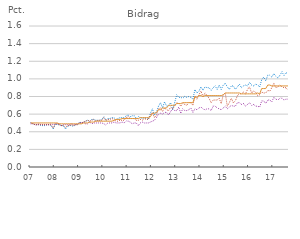
| Category | Nyudlån (variabel rente) | Nyudlån (fast rente) | Nyudlån (samlet) | Udestående udlån |
|---|---|---|---|---|
| 07 | 0.5 | 0.49 | 0.5 | 0.5 |
|  | 0.49 | 0.49 | 0.49 | 0.5 |
|  | 0.48 | 0.48 | 0.48 | 0.5 |
|  | 0.48 | 0.48 | 0.48 | 0.5 |
|  | 0.48 | 0.49 | 0.48 | 0.5 |
|  | 0.47 | 0.48 | 0.48 | 0.5 |
|  | 0.47 | 0.48 | 0.48 | 0.5 |
|  | 0.47 | 0.48 | 0.48 | 0.5 |
|  | 0.48 | 0.48 | 0.48 | 0.5 |
|  | 0.48 | 0.48 | 0.48 | 0.5 |
|  | 0.47 | 0.49 | 0.48 | 0.5 |
|  | 0.43 | 0.48 | 0.44 | 0.5 |
| 08 | 0.49 | 0.49 | 0.49 | 0.5 |
|  | 0.48 | 0.49 | 0.49 | 0.5 |
|  | 0.48 | 0.49 | 0.48 | 0.49 |
|  | 0.47 | 0.47 | 0.47 | 0.49 |
|  | 0.47 | 0.48 | 0.47 | 0.49 |
|  | 0.43 | 0.48 | 0.45 | 0.49 |
|  | 0.46 | 0.48 | 0.47 | 0.49 |
|  | 0.47 | 0.48 | 0.47 | 0.49 |
|  | 0.47 | 0.49 | 0.48 | 0.49 |
|  | 0.46 | 0.48 | 0.47 | 0.49 |
|  | 0.48 | 0.48 | 0.48 | 0.49 |
|  | 0.48 | 0.49 | 0.48 | 0.49 |
| 09 | 0.51 | 0.5 | 0.5 | 0.49 |
|  | 0.5 | 0.5 | 0.5 | 0.49 |
|  | 0.51 | 0.51 | 0.51 | 0.5 |
|  | 0.52 | 0.49 | 0.52 | 0.5 |
|  | 0.53 | 0.49 | 0.53 | 0.5 |
|  | 0.52 | 0.51 | 0.52 | 0.51 |
|  | 0.54 | 0.49 | 0.53 | 0.51 |
|  | 0.54 | 0.5 | 0.54 | 0.51 |
|  | 0.53 | 0.5 | 0.52 | 0.52 |
|  | 0.53 | 0.5 | 0.53 | 0.52 |
|  | 0.53 | 0.5 | 0.53 | 0.52 |
|  | 0.54 | 0.5 | 0.53 | 0.52 |
| 10 | 0.57 | 0.49 | 0.56 | 0.52 |
|  | 0.53 | 0.48 | 0.53 | 0.52 |
|  | 0.55 | 0.5 | 0.54 | 0.52 |
|  | 0.55 | 0.5 | 0.54 | 0.52 |
|  | 0.56 | 0.5 | 0.55 | 0.52 |
|  | 0.56 | 0.51 | 0.54 | 0.53 |
|  | 0.54 | 0.5 | 0.52 | 0.54 |
|  | 0.55 | 0.5 | 0.52 | 0.54 |
|  | 0.56 | 0.5 | 0.53 | 0.54 |
|  | 0.56 | 0.51 | 0.53 | 0.55 |
|  | 0.56 | 0.5 | 0.53 | 0.55 |
|  | 0.58 | 0.52 | 0.56 | 0.55 |
| 11 | 0.59 | 0.52 | 0.57 | 0.55 |
|  | 0.57 | 0.51 | 0.55 | 0.55 |
|  | 0.58 | 0.49 | 0.55 | 0.55 |
|  | 0.58 | 0.5 | 0.55 | 0.55 |
|  | 0.55 | 0.5 | 0.53 | 0.55 |
|  | 0.57 | 0.47 | 0.53 | 0.55 |
|  | 0.56 | 0.5 | 0.54 | 0.56 |
|  | 0.55 | 0.51 | 0.53 | 0.56 |
|  | 0.56 | 0.5 | 0.55 | 0.56 |
|  | 0.55 | 0.5 | 0.54 | 0.56 |
|  | 0.54 | 0.5 | 0.54 | 0.56 |
|  | 0.61 | 0.51 | 0.59 | 0.57 |
| 12 | 0.66 | 0.52 | 0.62 | 0.61 |
|  | 0.59 | 0.53 | 0.56 | 0.61 |
|  | 0.62 | 0.56 | 0.59 | 0.62 |
|  | 0.69 | 0.6 | 0.66 | 0.65 |
|  | 0.73 | 0.61 | 0.67 | 0.65 |
|  | 0.67 | 0.6 | 0.63 | 0.67 |
|  | 0.74 | 0.62 | 0.67 | 0.67 |
|  | 0.69 | 0.62 | 0.65 | 0.67 |
|  | 0.7 | 0.59 | 0.64 | 0.7 |
|  | 0.73 | 0.63 | 0.68 | 0.7 |
|  | 0.65 | 0.66 | 0.66 | 0.7 |
|  | 0.73 | 0.64 | 0.69 | 0.7 |
| 13 | 0.82 | 0.64 | 0.73 | 0.72 |
|  | 0.79 | 0.68 | 0.72 | 0.72 |
|  | 0.79 | 0.61 | 0.69 | 0.72 |
|  | 0.78 | 0.66 | 0.72 | 0.73 |
|  | 0.8 | 0.64 | 0.71 | 0.73 |
|  | 0.79 | 0.64 | 0.7 | 0.73 |
|  | 0.8 | 0.65 | 0.73 | 0.73 |
|  | 0.79 | 0.67 | 0.73 | 0.73 |
|  | 0.77 | 0.62 | 0.7 | 0.73 |
|  | 0.88 | 0.66 | 0.8 | 0.8 |
|  | 0.84 | 0.65 | 0.77 | 0.79 |
|  | 0.86 | 0.67 | 0.82 | 0.81 |
| 14 | 0.91 | 0.68 | 0.86 | 0.81 |
|  | 0.87 | 0.66 | 0.8 | 0.8 |
|  | 0.91 | 0.65 | 0.84 | 0.81 |
|  | 0.9 | 0.66 | 0.81 | 0.81 |
|  | 0.9 | 0.66 | 0.78 | 0.81 |
|  | 0.87 | 0.64 | 0.73 | 0.81 |
|  | 0.9 | 0.69 | 0.76 | 0.81 |
|  | 0.92 | 0.69 | 0.76 | 0.81 |
|  | 0.88 | 0.67 | 0.76 | 0.81 |
|  | 0.93 | 0.66 | 0.78 | 0.81 |
|  | 0.88 | 0.65 | 0.72 | 0.81 |
|  | 0.93 | 0.67 | 0.82 | 0.82 |
| 15 | 0.95 | 0.69 | 0.84 | 0.84 |
|  | 0.91 | 0.66 | 0.69 | 0.84 |
|  | 0.88 | 0.68 | 0.73 | 0.84 |
|  | 0.92 | 0.7 | 0.78 | 0.84 |
|  | 0.92 | 0.69 | 0.73 | 0.84 |
|  | 0.88 | 0.69 | 0.75 | 0.84 |
|  | 0.91 | 0.73 | 0.81 | 0.84 |
|  | 0.94 | 0.73 | 0.83 | 0.84 |
|  | 0.9 | 0.71 | 0.83 | 0.83 |
|  | 0.92 | 0.72 | 0.85 | 0.83 |
|  | 0.93 | 0.69 | 0.83 | 0.83 |
|  | 0.92 | 0.71 | 0.88 | 0.83 |
| 16 | 0.96 | 0.73 | 0.91 | 0.83 |
|  | 0.93 | 0.7 | 0.84 | 0.83 |
|  | 0.92 | 0.71 | 0.86 | 0.83 |
|  | 0.94 | 0.69 | 0.85 | 0.83 |
|  | 0.93 | 0.69 | 0.81 | 0.84 |
|  | 0.91 | 0.68 | 0.82 | 0.83 |
|  | 0.99 | 0.75 | 0.85 | 0.89 |
|  | 1.02 | 0.75 | 0.84 | 0.89 |
|  | 0.98 | 0.72 | 0.84 | 0.89 |
|  | 1.04 | 0.76 | 0.87 | 0.93 |
|  | 1.04 | 0.76 | 0.86 | 0.93 |
|  | 1.02 | 0.74 | 0.9 | 0.92 |
| 17 | 1.06 | 0.79 | 0.95 | 0.92 |